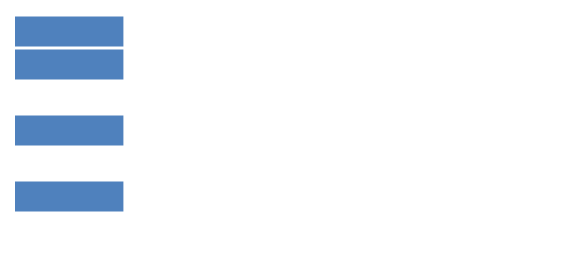
| Category | Series 0 |
|---|---|
| 0 | 1 |
| 1 | 1 |
| 2 | 0 |
| 3 | 1 |
| 4 | 0 |
| 5 | 1 |
| 6 | 0 |